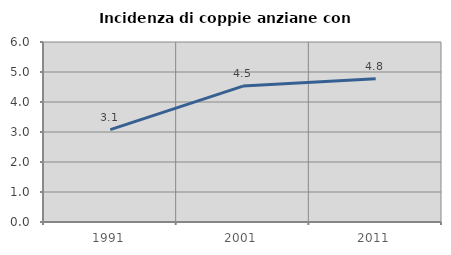
| Category | Incidenza di coppie anziane con figli |
|---|---|
| 1991.0 | 3.077 |
| 2001.0 | 4.531 |
| 2011.0 | 4.778 |